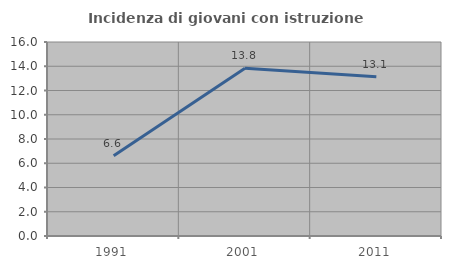
| Category | Incidenza di giovani con istruzione universitaria |
|---|---|
| 1991.0 | 6.623 |
| 2001.0 | 13.836 |
| 2011.0 | 13.139 |